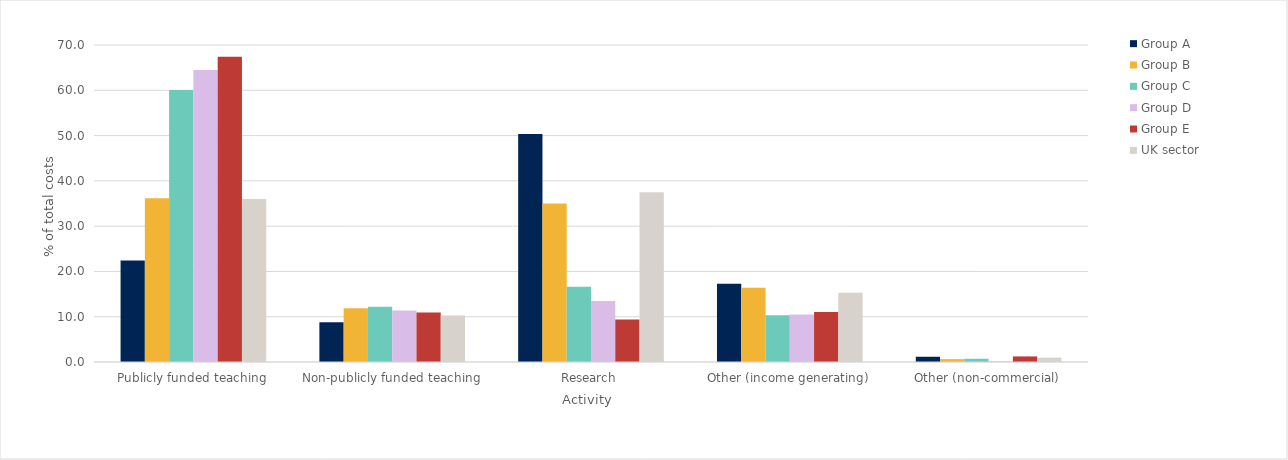
| Category | Group A | Group B | Group C | Group D | Group E | UK sector |
|---|---|---|---|---|---|---|
| Publicly funded teaching | 22.429 | 36.165 | 60.075 | 64.496 | 67.417 | 36.014 |
| Non-publicly funded teaching | 8.773 | 11.852 | 12.225 | 11.397 | 10.919 | 10.28 |
| Research | 50.355 | 34.98 | 16.643 | 13.478 | 9.366 | 37.479 |
| Other (income generating) | 17.282 | 16.372 | 10.341 | 10.466 | 11.068 | 15.28 |
| Other (non-commercial) | 1.16 | 0.631 | 0.716 | 0.164 | 1.23 | 0.948 |